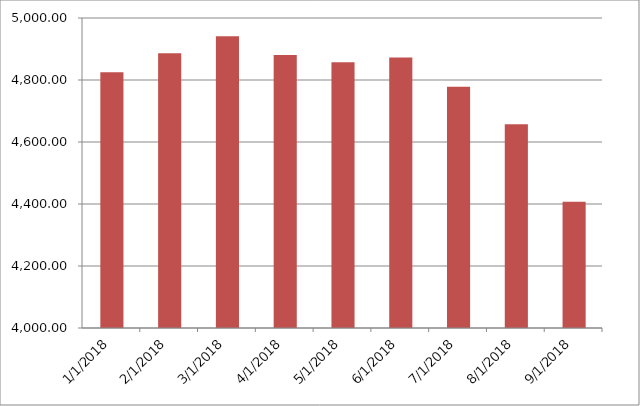
| Category | Series 0 | Series 1 |
|---|---|---|
| 1/1/18 |  | 4824.67 |
| 2/1/18 |  | 4886.02 |
| 3/1/18 |  | 4940.96 |
| 4/1/18 |  | 4880.65 |
| 5/1/18 |  | 4856.99 |
| 6/1/18 |  | 4872.61 |
| 7/1/18 |  | 4778.58 |
| 8/1/18 |  | 4657.45 |
| 9/1/18 |  | 4407.05 |